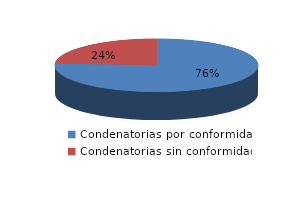
| Category | Series 0 |
|---|---|
| 0 | 1591 |
| 1 | 502 |